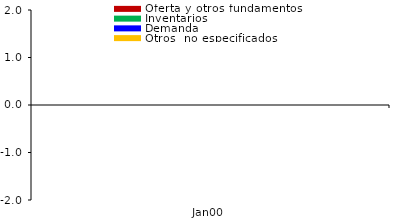
| Category | Oferta y otros fundamentos | Inventarios | Demanda | Otros  no especificados |
|---|---|---|---|---|
| Ene. | 0.126 | 0.003 | 0.164 | 0.237 |
| Feb. | -0.024 | -0.002 | 0.225 | 0.676 |
| Mar. | 0.02 | 0.137 | 0.272 | 0.818 |
| Abr. | -0.234 | 0.164 | 0.382 | 0.316 |
| May. | 0.282 | 0.171 | 0.445 | -0.068 |
| Jun. | 0.369 | 0.032 | 0.651 | -0.168 |
| Jul. | 0.062 | 0.007 | 0.661 | 0.176 |
| Ago. | -0.601 | -0.034 | 0.988 | -0.028 |
| Sep. | -0.482 | 0.287 | 1.008 | -0.056 |
| Oct. | -0.664 | 0.509 | 1.363 | -0.483 |